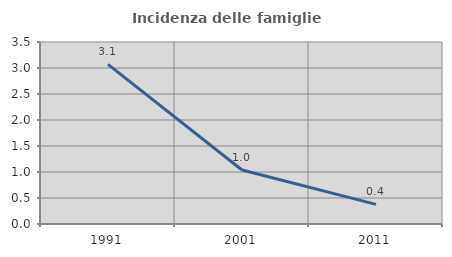
| Category | Incidenza delle famiglie numerose |
|---|---|
| 1991.0 | 3.069 |
| 2001.0 | 1.038 |
| 2011.0 | 0.377 |